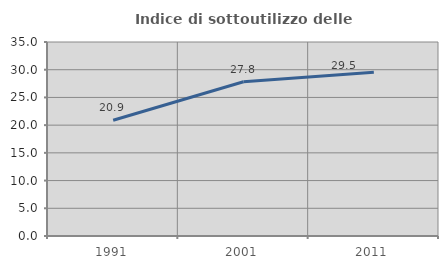
| Category | Indice di sottoutilizzo delle abitazioni  |
|---|---|
| 1991.0 | 20.877 |
| 2001.0 | 27.82 |
| 2011.0 | 29.525 |